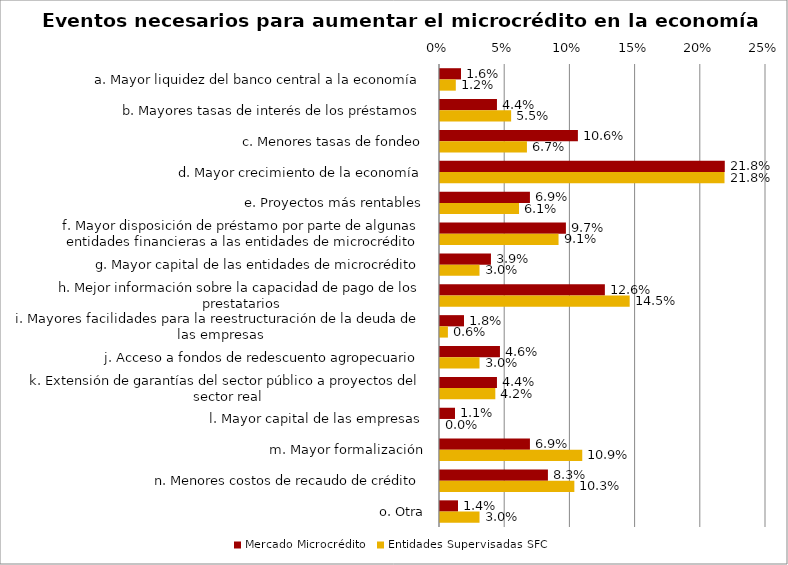
| Category | Mercado Microcrédito | Entidades Supervisadas SFC |
|---|---|---|
| a. Mayor liquidez del banco central a la economía | 0.016 | 0.012 |
| b. Mayores tasas de interés de los préstamos | 0.044 | 0.055 |
| c. Menores tasas de fondeo | 0.106 | 0.067 |
| d. Mayor crecimiento de la economía | 0.218 | 0.218 |
| e. Proyectos más rentables | 0.069 | 0.061 |
| f. Mayor disposición de préstamo por parte de algunas entidades financieras a las entidades de microcrédito | 0.097 | 0.091 |
| g. Mayor capital de las entidades de microcrédito | 0.039 | 0.03 |
| h. Mejor información sobre la capacidad de pago de los prestatarios | 0.126 | 0.145 |
| i. Mayores facilidades para la reestructuración de la deuda de las empresas | 0.018 | 0.006 |
| j. Acceso a fondos de redescuento agropecuario | 0.046 | 0.03 |
| k. Extensión de garantías del sector público a proyectos del sector real | 0.044 | 0.042 |
| l. Mayor capital de las empresas | 0.011 | 0 |
| m. Mayor formalización | 0.069 | 0.109 |
| n. Menores costos de recaudo de crédito | 0.083 | 0.103 |
| o. Otra | 0.014 | 0.03 |